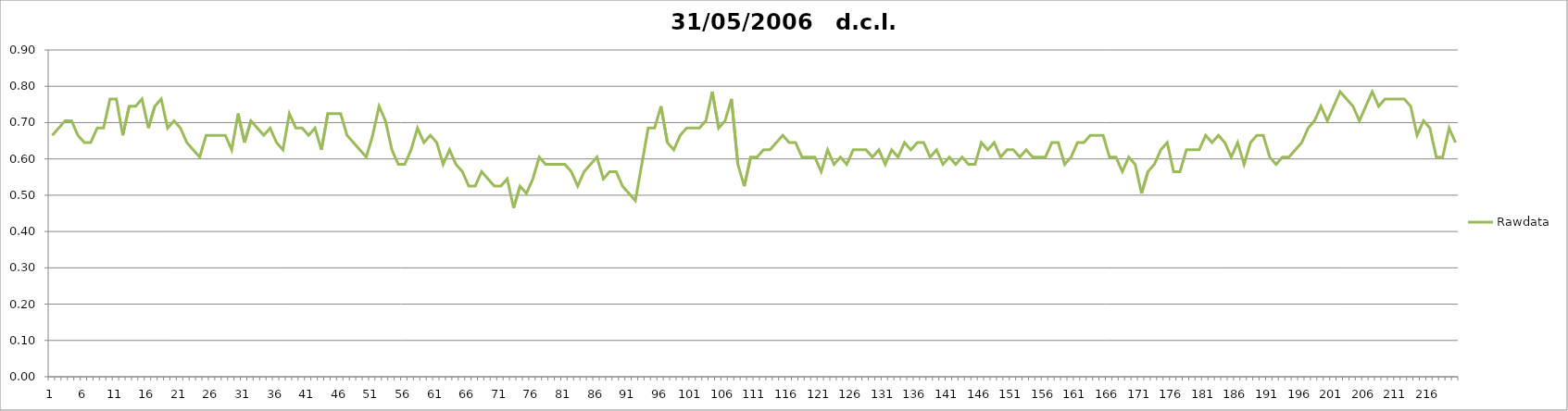
| Category | Rawdata |
|---|---|
| 0 | 0.665 |
| 1 | 0.685 |
| 2 | 0.705 |
| 3 | 0.705 |
| 4 | 0.665 |
| 5 | 0.645 |
| 6 | 0.645 |
| 7 | 0.685 |
| 8 | 0.685 |
| 9 | 0.765 |
| 10 | 0.765 |
| 11 | 0.665 |
| 12 | 0.745 |
| 13 | 0.745 |
| 14 | 0.765 |
| 15 | 0.685 |
| 16 | 0.745 |
| 17 | 0.765 |
| 18 | 0.685 |
| 19 | 0.705 |
| 20 | 0.685 |
| 21 | 0.645 |
| 22 | 0.625 |
| 23 | 0.605 |
| 24 | 0.665 |
| 25 | 0.665 |
| 26 | 0.665 |
| 27 | 0.665 |
| 28 | 0.625 |
| 29 | 0.725 |
| 30 | 0.645 |
| 31 | 0.705 |
| 32 | 0.685 |
| 33 | 0.665 |
| 34 | 0.685 |
| 35 | 0.645 |
| 36 | 0.625 |
| 37 | 0.725 |
| 38 | 0.685 |
| 39 | 0.685 |
| 40 | 0.665 |
| 41 | 0.685 |
| 42 | 0.625 |
| 43 | 0.725 |
| 44 | 0.725 |
| 45 | 0.725 |
| 46 | 0.665 |
| 47 | 0.645 |
| 48 | 0.625 |
| 49 | 0.605 |
| 50 | 0.665 |
| 51 | 0.745 |
| 52 | 0.705 |
| 53 | 0.625 |
| 54 | 0.585 |
| 55 | 0.585 |
| 56 | 0.625 |
| 57 | 0.685 |
| 58 | 0.645 |
| 59 | 0.665 |
| 60 | 0.645 |
| 61 | 0.585 |
| 62 | 0.625 |
| 63 | 0.585 |
| 64 | 0.565 |
| 65 | 0.525 |
| 66 | 0.525 |
| 67 | 0.565 |
| 68 | 0.545 |
| 69 | 0.525 |
| 70 | 0.525 |
| 71 | 0.545 |
| 72 | 0.465 |
| 73 | 0.525 |
| 74 | 0.505 |
| 75 | 0.545 |
| 76 | 0.605 |
| 77 | 0.585 |
| 78 | 0.585 |
| 79 | 0.585 |
| 80 | 0.585 |
| 81 | 0.565 |
| 82 | 0.525 |
| 83 | 0.565 |
| 84 | 0.585 |
| 85 | 0.605 |
| 86 | 0.545 |
| 87 | 0.565 |
| 88 | 0.565 |
| 89 | 0.525 |
| 90 | 0.505 |
| 91 | 0.485 |
| 92 | 0.585 |
| 93 | 0.685 |
| 94 | 0.685 |
| 95 | 0.745 |
| 96 | 0.645 |
| 97 | 0.625 |
| 98 | 0.665 |
| 99 | 0.685 |
| 100 | 0.685 |
| 101 | 0.685 |
| 102 | 0.705 |
| 103 | 0.785 |
| 104 | 0.685 |
| 105 | 0.705 |
| 106 | 0.765 |
| 107 | 0.585 |
| 108 | 0.525 |
| 109 | 0.605 |
| 110 | 0.605 |
| 111 | 0.625 |
| 112 | 0.625 |
| 113 | 0.645 |
| 114 | 0.665 |
| 115 | 0.645 |
| 116 | 0.645 |
| 117 | 0.605 |
| 118 | 0.605 |
| 119 | 0.605 |
| 120 | 0.565 |
| 121 | 0.625 |
| 122 | 0.585 |
| 123 | 0.605 |
| 124 | 0.585 |
| 125 | 0.625 |
| 126 | 0.625 |
| 127 | 0.625 |
| 128 | 0.605 |
| 129 | 0.625 |
| 130 | 0.585 |
| 131 | 0.625 |
| 132 | 0.605 |
| 133 | 0.645 |
| 134 | 0.625 |
| 135 | 0.645 |
| 136 | 0.645 |
| 137 | 0.605 |
| 138 | 0.625 |
| 139 | 0.585 |
| 140 | 0.605 |
| 141 | 0.585 |
| 142 | 0.605 |
| 143 | 0.585 |
| 144 | 0.585 |
| 145 | 0.645 |
| 146 | 0.625 |
| 147 | 0.645 |
| 148 | 0.605 |
| 149 | 0.625 |
| 150 | 0.625 |
| 151 | 0.605 |
| 152 | 0.625 |
| 153 | 0.605 |
| 154 | 0.605 |
| 155 | 0.605 |
| 156 | 0.645 |
| 157 | 0.645 |
| 158 | 0.585 |
| 159 | 0.605 |
| 160 | 0.645 |
| 161 | 0.645 |
| 162 | 0.665 |
| 163 | 0.665 |
| 164 | 0.665 |
| 165 | 0.605 |
| 166 | 0.605 |
| 167 | 0.565 |
| 168 | 0.605 |
| 169 | 0.585 |
| 170 | 0.505 |
| 171 | 0.565 |
| 172 | 0.585 |
| 173 | 0.625 |
| 174 | 0.645 |
| 175 | 0.565 |
| 176 | 0.565 |
| 177 | 0.625 |
| 178 | 0.625 |
| 179 | 0.625 |
| 180 | 0.665 |
| 181 | 0.645 |
| 182 | 0.665 |
| 183 | 0.645 |
| 184 | 0.605 |
| 185 | 0.645 |
| 186 | 0.585 |
| 187 | 0.645 |
| 188 | 0.665 |
| 189 | 0.665 |
| 190 | 0.605 |
| 191 | 0.585 |
| 192 | 0.605 |
| 193 | 0.605 |
| 194 | 0.625 |
| 195 | 0.645 |
| 196 | 0.685 |
| 197 | 0.705 |
| 198 | 0.745 |
| 199 | 0.705 |
| 200 | 0.745 |
| 201 | 0.785 |
| 202 | 0.765 |
| 203 | 0.745 |
| 204 | 0.705 |
| 205 | 0.745 |
| 206 | 0.785 |
| 207 | 0.745 |
| 208 | 0.765 |
| 209 | 0.765 |
| 210 | 0.765 |
| 211 | 0.765 |
| 212 | 0.745 |
| 213 | 0.665 |
| 214 | 0.705 |
| 215 | 0.685 |
| 216 | 0.605 |
| 217 | 0.605 |
| 218 | 0.685 |
| 219 | 0.645 |